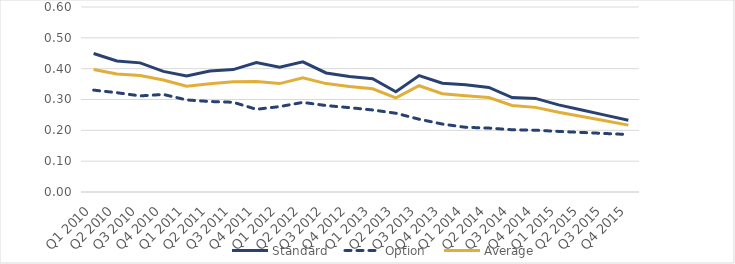
| Category | Standard | Option | Average |
|---|---|---|---|
| Q1 2010 | 0.449 | 0.33 | 0.397 |
| Q2 2010 | 0.425 | 0.322 | 0.382 |
| Q3 2010 | 0.419 | 0.312 | 0.378 |
| Q4 2010 | 0.391 | 0.316 | 0.363 |
| Q1 2011 | 0.376 | 0.299 | 0.343 |
| Q2 2011 | 0.392 | 0.293 | 0.351 |
| Q3 2011 | 0.397 | 0.291 | 0.357 |
| Q4 2011 | 0.42 | 0.268 | 0.358 |
| Q1 2012 | 0.405 | 0.277 | 0.352 |
| Q2 2012 | 0.422 | 0.291 | 0.37 |
| Q3 2012 | 0.386 | 0.28 | 0.352 |
| Q4 2012 | 0.375 | 0.274 | 0.342 |
| Q1 2013 | 0.367 | 0.266 | 0.335 |
| Q2 2013 | 0.325 | 0.255 | 0.305 |
| Q3 2013 | 0.378 | 0.236 | 0.345 |
| Q4 2013 | 0.353 | 0.22 | 0.319 |
| Q1 2014 | 0.348 | 0.21 | 0.312 |
| Q2 2014 | 0.339 | 0.207 | 0.306 |
| Q3 2014 | 0.306 | 0.202 | 0.281 |
| Q4 2014 | 0.304 | 0.2 | 0.274 |
| Q1 2015 | 0.283 | 0.196 | 0.259 |
| Q2 2015 | 0.266 | 0.193 | 0.245 |
| Q3 2015 | 0.249 | 0.19 | 0.231 |
| Q4 2015 | 0.233 | 0.186 | 0.217 |